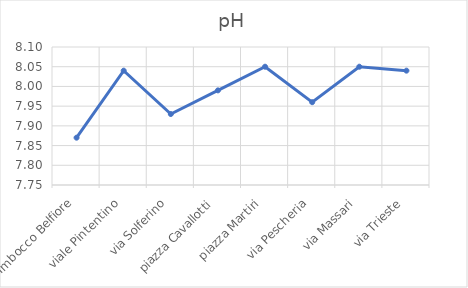
| Category |  pH |
|---|---|
| Imbocco Belfiore | 7.87 |
| viale Pintentino | 8.04 |
| via Solferino | 7.93 |
| piazza Cavallotti | 7.99 |
| piazza Martiri | 8.05 |
| via Pescheria | 7.96 |
| via Massari | 8.05 |
| via Trieste | 8.04 |